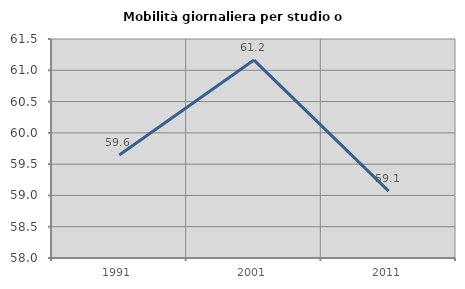
| Category | Mobilità giornaliera per studio o lavoro |
|---|---|
| 1991.0 | 59.647 |
| 2001.0 | 61.163 |
| 2011.0 | 59.069 |